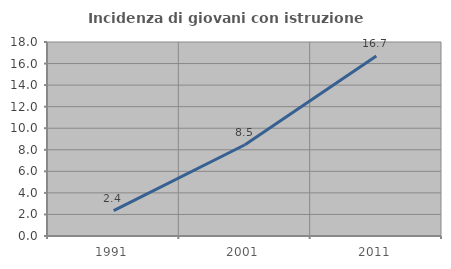
| Category | Incidenza di giovani con istruzione universitaria |
|---|---|
| 1991.0 | 2.353 |
| 2001.0 | 8.467 |
| 2011.0 | 16.691 |